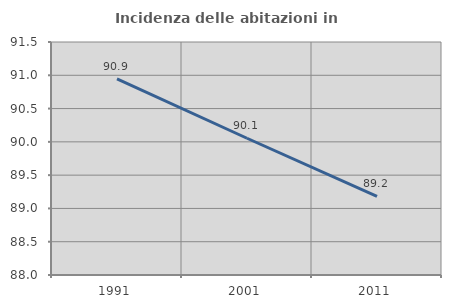
| Category | Incidenza delle abitazioni in proprietà  |
|---|---|
| 1991.0 | 90.945 |
| 2001.0 | 90.054 |
| 2011.0 | 89.18 |